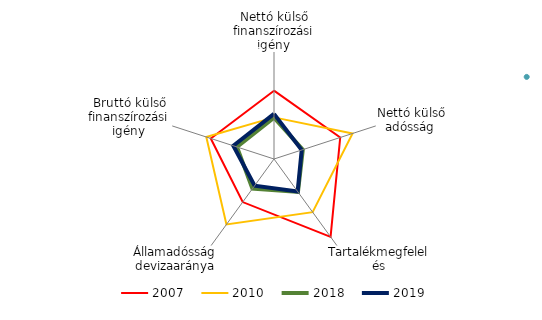
| Category | 2007 | 2008 | 2010 | 2018 | 2019 |
|---|---|---|---|---|---|
| Nettó külső finanszírozási igény | 0.83 |  | -0.665 | -0.687 | -0.471 |
| Nettó külső adósság  | 0.904 |  | 1.632 | -1.301 | -1.366 |
| Tartalékmegfelelés | 2.397 |  | 0.683 | -0.713 | -0.743 |
| Államadósság devizaaránya | -0.015 |  | 1.538 | -0.941 | -1.15 |
| Bruttó külső finanszírozási igény | 0.727 |  | 0.991 | -0.816 | -0.603 |